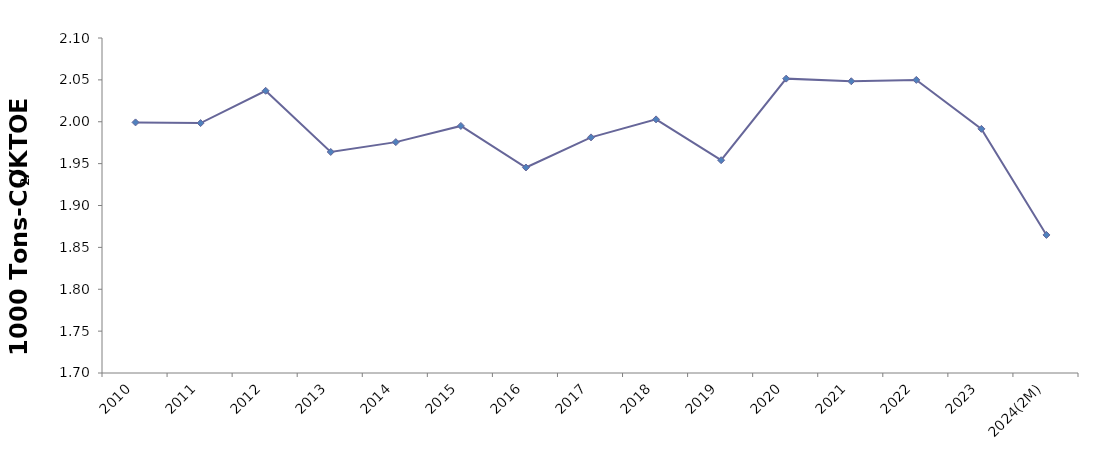
| Category | CO2/TPEC
(1,000 Tons-CO2/ KTOE) |
|---|---|
| 2010 | 1.999 |
| 2011 | 1.998 |
| 2012 | 2.037 |
| 2013 | 1.964 |
| 2014 | 1.976 |
| 2015 | 1.995 |
| 2016 | 1.945 |
| 2017 | 1.981 |
| 2018 | 2.003 |
| 2019 | 1.954 |
| 2020 | 2.051 |
| 2021 | 2.048 |
| 2022 | 2.05 |
| 2023 | 1.992 |
| 2024(2M) | 1.865 |